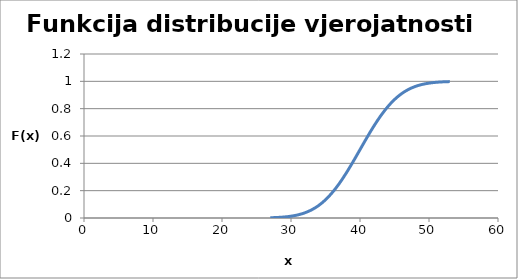
| Category | Series 0 |
|---|---|
| 27.0 | 0.002 |
| 28.0 | 0.004 |
| 29.0 | 0.007 |
| 30.0 | 0.013 |
| 31.0 | 0.023 |
| 32.0 | 0.038 |
| 33.0 | 0.06 |
| 34.0 | 0.091 |
| 35.0 | 0.133 |
| 36.0 | 0.187 |
| 37.0 | 0.252 |
| 38.0 | 0.328 |
| 39.0 | 0.412 |
| 40.0 | 0.5 |
| 41.0 | 0.588 |
| 42.0 | 0.672 |
| 43.0 | 0.748 |
| 44.0 | 0.813 |
| 45.0 | 0.867 |
| 46.0 | 0.909 |
| 47.0 | 0.94 |
| 48.0 | 0.962 |
| 49.0 | 0.977 |
| 50.0 | 0.987 |
| 51.0 | 0.993 |
| 52.0 | 0.996 |
| 53.0 | 0.998 |